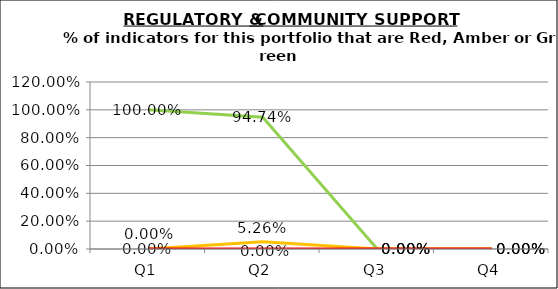
| Category | Green | Amber | Red |
|---|---|---|---|
| Q1 | 1 | 0 | 0 |
| Q2 | 0.947 | 0.053 | 0 |
| Q3 | 0 | 0 | 0 |
| Q4 | 0 | 0 | 0 |